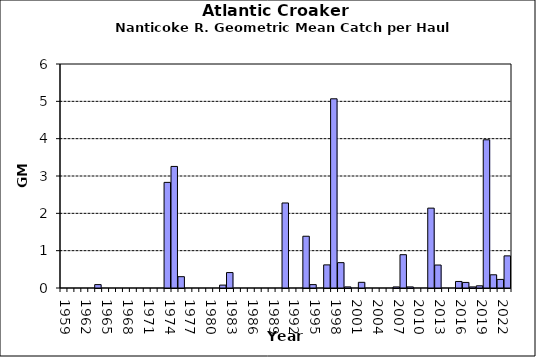
| Category | Series 0 |
|---|---|
| 1959.0 | 0 |
| 1960.0 | 0 |
| 1961.0 | 0 |
| 1962.0 | 0 |
| 1963.0 | 0 |
| 1964.0 | 0.091 |
| 1965.0 | 0 |
| 1966.0 | 0 |
| 1967.0 | 0 |
| 1968.0 | 0 |
| 1969.0 | 0 |
| 1970.0 | 0 |
| 1971.0 | 0 |
| 1972.0 | 0 |
| 1973.0 | 0 |
| 1974.0 | 2.829 |
| 1975.0 | 3.256 |
| 1976.0 | 0.303 |
| 1977.0 | 0 |
| 1978.0 | 0 |
| 1979.0 | 0 |
| 1980.0 | 0 |
| 1981.0 | 0 |
| 1982.0 | 0.078 |
| 1983.0 | 0.413 |
| 1984.0 | 0 |
| 1985.0 | 0 |
| 1986.0 | 0 |
| 1987.0 | 0 |
| 1988.0 | 0 |
| 1989.0 | 0 |
| 1990.0 | 0 |
| 1991.0 | 2.277 |
| 1992.0 | 0 |
| 1993.0 | 0 |
| 1994.0 | 1.386 |
| 1995.0 | 0.091 |
| 1996.0 | 0 |
| 1997.0 | 0.619 |
| 1998.0 | 5.068 |
| 1999.0 | 0.679 |
| 2000.0 | 0.029 |
| 2001.0 | 0 |
| 2002.0 | 0.152 |
| 2003.0 | 0 |
| 2004.0 | 0 |
| 2005.0 | 0 |
| 2006.0 | 0 |
| 2007.0 | 0.029 |
| 2008.0 | 0.892 |
| 2009.0 | 0.029 |
| 2010.0 | 0 |
| 2011.0 | 0 |
| 2012.0 | 2.139 |
| 2013.0 | 0.615 |
| 2014.0 | 0 |
| 2015.0 | 0 |
| 2016.0 | 0.175 |
| 2017.0 | 0.149 |
| 2018.0 | 0.029 |
| 2019.0 | 0.059 |
| 2020.0 | 3.97 |
| 2021.0 | 0.354 |
| 2022.0 | 0.23 |
| 2023.0 | 0.861 |